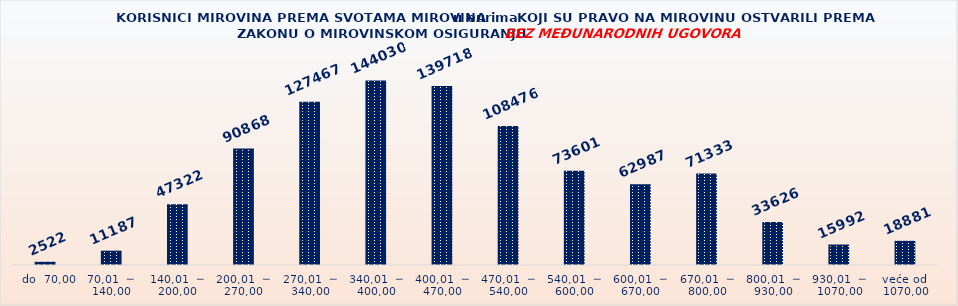
| Category | KORISNICI MIROVINA PREMA VRSTAMA I SVOTAMA MIROVINA KOJI SU PRAVO NA MIROVINU OSTVARILI PREMA ZAKONU O MIROVINSKOM OSIGURANJU 
BEZ MEĐUNARODNIH UGOVORA |
|---|---|
|   do  70,00 | 2522 |
| 70,01  ─  140,00 | 11187 |
| 140,01  ─  200,00 | 47322 |
| 200,01  ─  270,00 | 90868 |
| 270,01  ─  340,00 | 127467 |
| 340,01  ─  400,00 | 144030 |
| 400,01  ─  470,00 | 139718 |
| 470,01  ─  540,00 | 108476 |
| 540,01  ─  600,00 | 73601 |
| 600,01  ─  670,00 | 62987 |
| 670,01  ─  800,00 | 71333 |
| 800,01  ─  930,00 | 33626 |
| 930,01  ─  1070,00 | 15992 |
| veće od  1070,00 | 18881 |